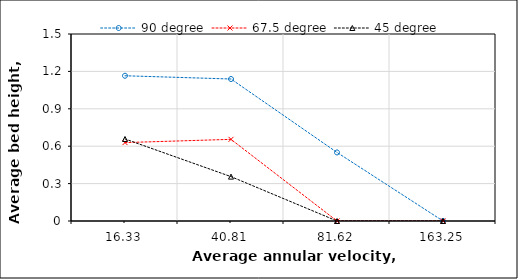
| Category | 90 degree | 67.5 degree | 45 degree |
|---|---|---|---|
| 16.33 | 1.165 | 0.629 | 0.658 |
| 40.81 | 1.139 | 0.655 | 0.356 |
| 81.62 | 0.55 | 0 | 0 |
| 163.25 | 0 | 0 | 0 |